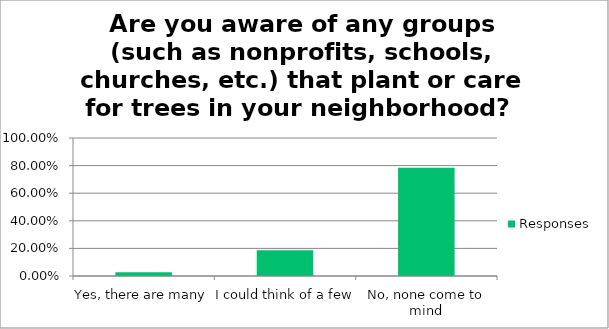
| Category | Responses |
|---|---|
| Yes, there are many | 0.028 |
| I could think of a few | 0.187 |
| No, none come to mind | 0.785 |